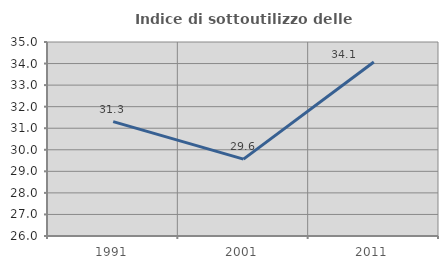
| Category | Indice di sottoutilizzo delle abitazioni  |
|---|---|
| 1991.0 | 31.304 |
| 2001.0 | 29.565 |
| 2011.0 | 34.075 |